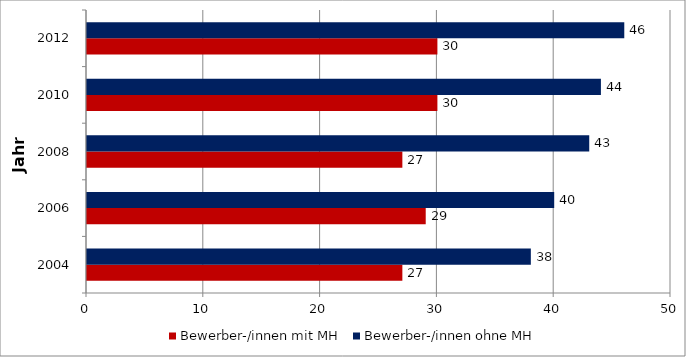
| Category | Bewerber-/innen mit MH | Bewerber-/innen ohne MH |
|---|---|---|
| 2004.0 | 27 | 38 |
| 2006.0 | 29 | 40 |
| 2008.0 | 27 | 43 |
| 2010.0 | 30 | 44 |
| 2012.0 | 30 | 46 |